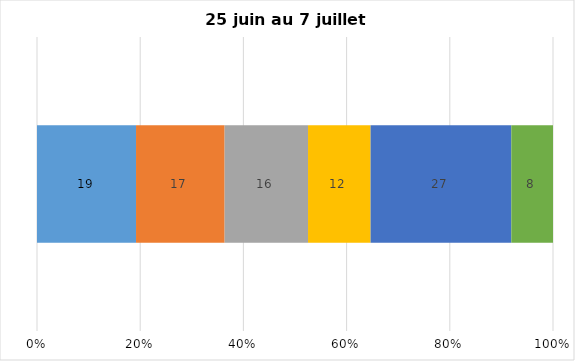
| Category | Plusieurs fois par jour | Une fois par jour | Quelques fois par semaine   | Une fois par semaine ou moins   |  Jamais   |  Je n’utilise pas les médias sociaux |
|---|---|---|---|---|---|---|
| 0 | 19 | 17 | 16 | 12 | 27 | 8 |